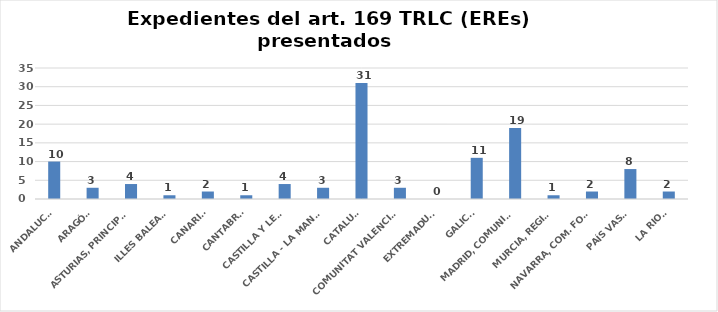
| Category | Series 0 |
|---|---|
| ANDALUCÍA | 10 |
| ARAGÓN | 3 |
| ASTURIAS, PRINCIPADO | 4 |
| ILLES BALEARS | 1 |
| CANARIAS | 2 |
| CANTABRIA | 1 |
| CASTILLA Y LEÓN | 4 |
| CASTILLA - LA MANCHA | 3 |
| CATALUÑA | 31 |
| COMUNITAT VALENCIANA | 3 |
| EXTREMADURA | 0 |
| GALICIA | 11 |
| MADRID, COMUNIDAD | 19 |
| MURCIA, REGIÓN | 1 |
| NAVARRA, COM. FORAL | 2 |
| PAÍS VASCO | 8 |
| LA RIOJA | 2 |